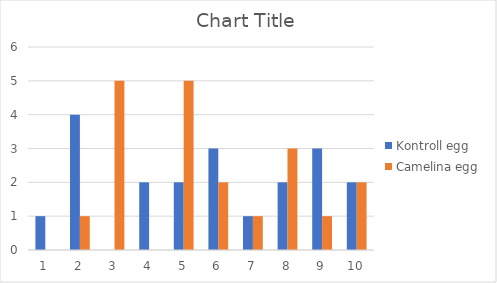
| Category | Kontroll egg | Camelina egg |
|---|---|---|
| 1.0 | 1 | 0 |
| 2.0 | 4 | 1 |
| 3.0 | 0 | 5 |
| 4.0 | 2 | 0 |
| 5.0 | 2 | 5 |
| 6.0 | 3 | 2 |
| 7.0 | 1 | 1 |
| 8.0 | 2 | 3 |
| 9.0 | 3 | 1 |
| 10.0 | 2 | 2 |